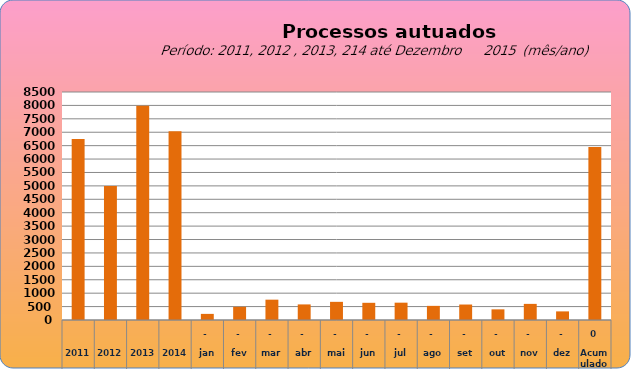
| Category | 6749 4997 7990 7034  228   486   758   581   676   641   646   527   577   397   601   321   6.439  |
|---|---|
| 2011 | 6749 |
| 2012 | 4997 |
| 2013 | 7990 |
| 2014 | 7034 |
| jan | 228 |
| fev | 492 |
| mar | 758 |
| abr | 581 |
| mai | 677 |
| jun | 641 |
| jul | 646 |
| ago | 527 |
| set | 577 |
| out | 397 |
| nov | 601 |
| dez | 321 |
| Acumulado
 | 6446 |